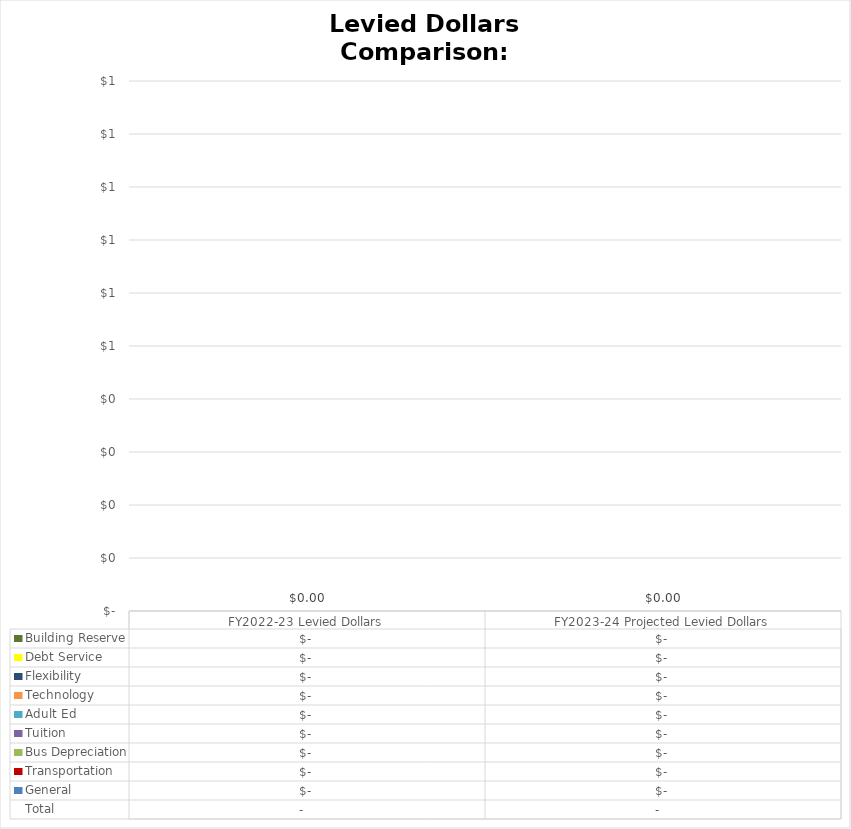
| Category |  General  |  Transportation  |  Bus Depreciation  |  Tuition  |  Adult Ed  |  Technology  |  Flexibility  |  Debt Service  |  Building Reserve  |
|---|---|---|---|---|---|---|---|---|---|
| FY2022-23 Levied Dollars | 0 | 0 | 0 | 0 | 0 | 0 | 0 | 0 | 0 |
|  FY2023-24 Projected Levied Dollars  | 0 | 0 | 0 | 0 | 0 | 0 | 0 | 0 | 0 |